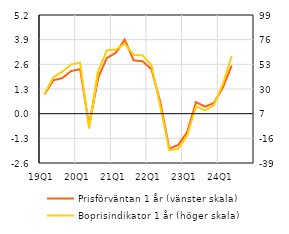
| Category | Prisförväntan 1 år (vänster skala) |
|---|---|
| 19Q1 | 1.015 |
| 19Q2 | 1.76 |
| 19Q3 | 1.875 |
| 19Q4 | 2.248 |
| 20Q1 | 2.346 |
| 20Q2 | -0.631 |
| 20Q3 | 1.875 |
| 20Q4 | 2.938 |
| 21Q1 | 3.203 |
| 21Q2 | 3.91 |
| 21Q3 | 2.808 |
| 21Q4 | 2.764 |
| 22Q1 | 2.344 |
| 22Q2 | 0.591 |
| 22Q3 | -1.839 |
| 22Q4 | -1.652 |
| 23Q1 | -0.97 |
| 23Q2 | 0.611 |
| 23Q3 | 0.369 |
| 23Q4 | 0.565 |
| 24Q1 | 1.369 |
| 24Q2 | 2.531 |